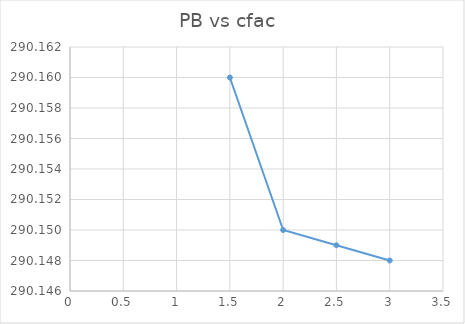
| Category | Series 0 |
|---|---|
| 1.5 | 290.16 |
| 2.0 | 290.15 |
| 2.5 | 290.149 |
| 3.0 | 290.148 |